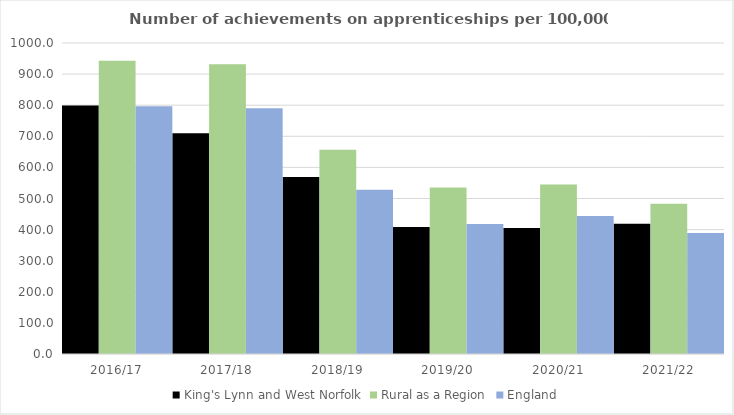
| Category | King's Lynn and West Norfolk | Rural as a Region | England |
|---|---|---|---|
| 2016/17 | 799 | 942.594 | 797 |
| 2017/18 | 710 | 931.709 | 790 |
| 2018/19 | 569 | 656.44 | 528 |
| 2019/20 | 408 | 535.552 | 418 |
| 2020/21 | 405 | 545.333 | 444 |
| 2021/22 | 419 | 482.936 | 389 |